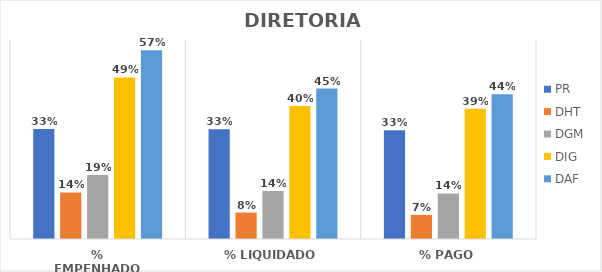
| Category | PR | DHT | DGM | DIG | DAF |
|---|---|---|---|---|---|
| % EMPENHADO | 0.332 | 0.14 | 0.193 | 0.487 | 0.569 |
| % LIQUIDADO | 0.331 | 0.08 | 0.145 | 0.401 | 0.454 |
| % PAGO | 0.328 | 0.073 | 0.137 | 0.393 | 0.436 |